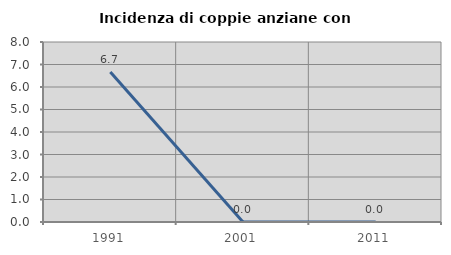
| Category | Incidenza di coppie anziane con figli |
|---|---|
| 1991.0 | 6.667 |
| 2001.0 | 0 |
| 2011.0 | 0 |